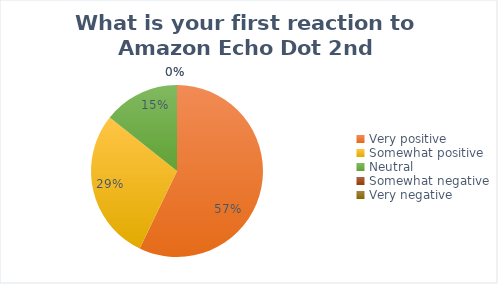
| Category | Series 0 |
|---|---|
| Very positive | 4 |
| Somewhat positive | 2 |
| Neutral | 1 |
| Somewhat negative | 0 |
| Very negative | 0 |